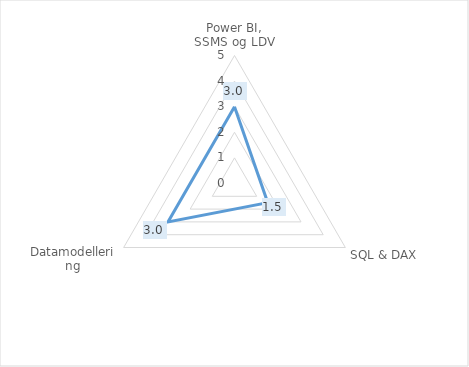
| Category | Series 0 |
|---|---|
| Power BI, SSMS og LDV | 3 |
| SQL & DAX | 1.5 |
| Datamodellering | 3 |